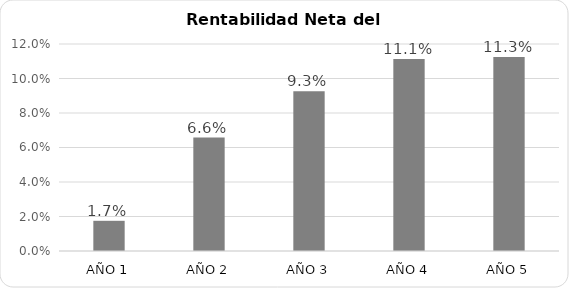
| Category | Rentabilidad Neta del Capital |
|---|---|
| AÑO 1 | 0.017 |
| AÑO 2 | 0.066 |
| AÑO 3 | 0.093 |
| AÑO 4 | 0.111 |
| AÑO 5 | 0.113 |